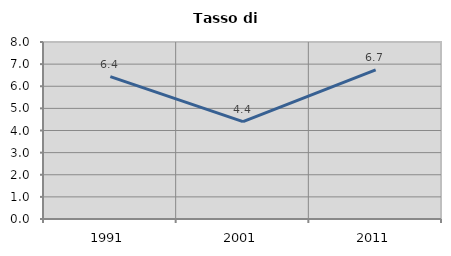
| Category | Tasso di disoccupazione   |
|---|---|
| 1991.0 | 6.435 |
| 2001.0 | 4.402 |
| 2011.0 | 6.736 |